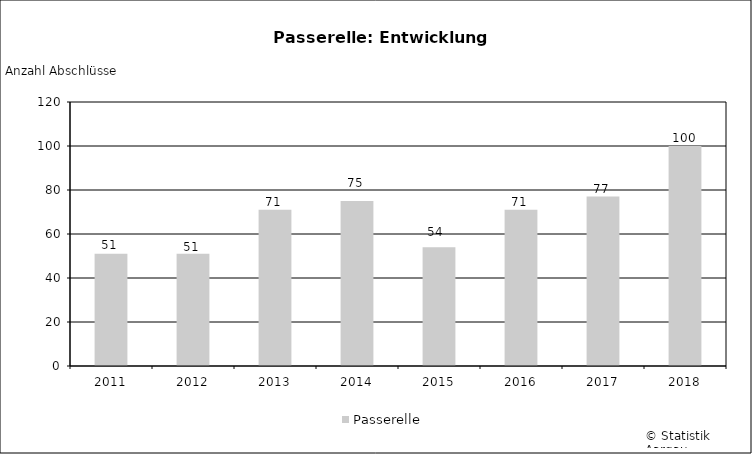
| Category | Passerelle |
|---|---|
| 2011 | 51 |
| 2012 | 51 |
| 2013 | 71 |
| 2014 | 75 |
| 2015 | 54 |
| 2016 | 71 |
| 2017 | 77 |
| 2018 | 100 |